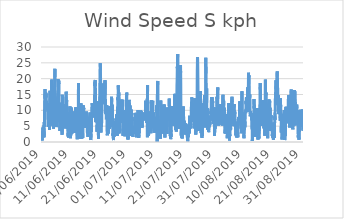
| Category | Wind Speed S |
|---|---|
| 01/06/2019 | 1.1 |
| 01/06/2019 | 1.3 |
| 01/06/2019 | 0.5 |
| 01/06/2019 | 2.7 |
| 01/06/2019 | 2.6 |
| 01/06/2019 | 2.9 |
| 01/06/2019 | 3.8 |
| 01/06/2019 | 4.6 |
| 01/06/2019 | 2.7 |
| 01/06/2019 | 2.6 |
| 01/06/2019 | 1.5 |
| 01/06/2019 | 2.6 |
| 01/06/2019 | 3.7 |
| 01/06/2019 | 4.8 |
| 01/06/2019 | 2.3 |
| 01/06/2019 | 3.3 |
| 01/06/2019 | 1.5 |
| 01/06/2019 | 4.6 |
| 01/06/2019 | 6.3 |
| 01/06/2019 | 4.8 |
| 01/06/2019 | 5.8 |
| 01/06/2019 | 10.3 |
| 01/06/2019 | 9.5 |
| 01/06/2019 | 13.1 |
| 02/06/2019 | 15.8 |
| 02/06/2019 | 16.7 |
| 02/06/2019 | 13.6 |
| 02/06/2019 | 13.5 |
| 02/06/2019 | 15 |
| 02/06/2019 | 13.7 |
| 02/06/2019 | 14.1 |
| 02/06/2019 | 15.6 |
| 02/06/2019 | 14 |
| 02/06/2019 | 15.3 |
| 02/06/2019 | 14.8 |
| 02/06/2019 | 14.3 |
| 02/06/2019 | 14.1 |
| 02/06/2019 | 12.6 |
| 02/06/2019 | 11.8 |
| 02/06/2019 | 10.7 |
| 02/06/2019 | 11.8 |
| 02/06/2019 | 11 |
| 02/06/2019 | 12.1 |
| 02/06/2019 | 10.6 |
| 02/06/2019 | 10 |
| 02/06/2019 | 11.6 |
| 02/06/2019 | 12.3 |
| 02/06/2019 | 10.1 |
| 03/06/2019 | 8.1 |
| 03/06/2019 | 8 |
| 03/06/2019 | 6.1 |
| 03/06/2019 | 4.8 |
| 03/06/2019 | 4.5 |
| 03/06/2019 | 5.1 |
| 03/06/2019 | 5.2 |
| 03/06/2019 | 4.9 |
| 03/06/2019 | 8 |
| 03/06/2019 | 11.1 |
| 03/06/2019 | 9.2 |
| 03/06/2019 | 9.6 |
| 03/06/2019 | 11 |
| 03/06/2019 | 12.2 |
| 03/06/2019 | 10.5 |
| 03/06/2019 | 3.9 |
| 03/06/2019 | 7.6 |
| 03/06/2019 | 5.5 |
| 03/06/2019 | 9 |
| 03/06/2019 | 16.2 |
| 03/06/2019 | 11.2 |
| 03/06/2019 | 9.7 |
| 03/06/2019 | 13.3 |
| 03/06/2019 | 16 |
| 04/06/2019 | 7.8 |
| 04/06/2019 | 7.8 |
| 04/06/2019 | 5.3 |
| 04/06/2019 | 8.8 |
| 04/06/2019 | 10.4 |
| 04/06/2019 | 7.4 |
| 04/06/2019 | 11.9 |
| 04/06/2019 | 14.7 |
| 04/06/2019 | 18.6 |
| 04/06/2019 | 19.7 |
| 04/06/2019 | 15.5 |
| 04/06/2019 | 16.2 |
| 04/06/2019 | 17.1 |
| 04/06/2019 | 17.3 |
| 04/06/2019 | 15.9 |
| 04/06/2019 | 12.7 |
| 04/06/2019 | 11.6 |
| 04/06/2019 | 10.7 |
| 04/06/2019 | 10.4 |
| 04/06/2019 | 8.7 |
| 04/06/2019 | 6.2 |
| 04/06/2019 | 5 |
| 04/06/2019 | 5.6 |
| 04/06/2019 | 5.1 |
| 05/06/2019 | 4.2 |
| 05/06/2019 | 5.1 |
| 05/06/2019 | 5 |
| 05/06/2019 | 6.3 |
| 05/06/2019 | 5.9 |
| 05/06/2019 | 4.8 |
| 05/06/2019 | 5.1 |
| 05/06/2019 | 6.1 |
| 05/06/2019 | 14.1 |
| 05/06/2019 | 17.4 |
| 05/06/2019 | 19.5 |
| 05/06/2019 | 21.9 |
| 05/06/2019 | 23.1 |
| 05/06/2019 | 20.5 |
| 05/06/2019 | 15.9 |
| 05/06/2019 | 13.1 |
| 05/06/2019 | 12.9 |
| 05/06/2019 | 13.1 |
| 05/06/2019 | 11.1 |
| 05/06/2019 | 9 |
| 05/06/2019 | 8.4 |
| 05/06/2019 | 6.4 |
| 05/06/2019 | 5.7 |
| 05/06/2019 | 7.4 |
| 06/06/2019 | 7.9 |
| 06/06/2019 | 5.9 |
| 06/06/2019 | 5.2 |
| 06/06/2019 | 5.4 |
| 06/06/2019 | 4.7 |
| 06/06/2019 | 6.2 |
| 06/06/2019 | 6.8 |
| 06/06/2019 | 9.4 |
| 06/06/2019 | 12.1 |
| 06/06/2019 | 13.4 |
| 06/06/2019 | 14 |
| 06/06/2019 | 12.3 |
| 06/06/2019 | 14.7 |
| 06/06/2019 | 15.3 |
| 06/06/2019 | 18.3 |
| 06/06/2019 | 19.9 |
| 06/06/2019 | 18.9 |
| 06/06/2019 | 17.7 |
| 06/06/2019 | 17.1 |
| 06/06/2019 | 16.9 |
| 06/06/2019 | 17.1 |
| 06/06/2019 | 19.4 |
| 06/06/2019 | 18.3 |
| 06/06/2019 | 13.5 |
| 07/06/2019 | 9.4 |
| 07/06/2019 | 6.3 |
| 07/06/2019 | 7.4 |
| 07/06/2019 | 7.5 |
| 07/06/2019 | 8.4 |
| 07/06/2019 | 6.5 |
| 07/06/2019 | 8.6 |
| 07/06/2019 | 3.5 |
| 07/06/2019 | 6.8 |
| 07/06/2019 | 10.2 |
| 07/06/2019 | 8.7 |
| 07/06/2019 | 12 |
| 07/06/2019 | 10.5 |
| 07/06/2019 | 12.4 |
| 07/06/2019 | 11.5 |
| 07/06/2019 | 10.3 |
| 07/06/2019 | 9.3 |
| 07/06/2019 | 9.7 |
| 07/06/2019 | 9.8 |
| 07/06/2019 | 9.7 |
| 07/06/2019 | 7.4 |
| 07/06/2019 | 6.2 |
| 07/06/2019 | 6.2 |
| 07/06/2019 | 8.1 |
| 08/06/2019 | 3.1 |
| 08/06/2019 | 2.3 |
| 08/06/2019 | 4.6 |
| 08/06/2019 | 14.9 |
| 08/06/2019 | 13 |
| 08/06/2019 | 13 |
| 08/06/2019 | 11.3 |
| 08/06/2019 | 8.5 |
| 08/06/2019 | 8.4 |
| 08/06/2019 | 8.9 |
| 08/06/2019 | 9.6 |
| 08/06/2019 | 10.6 |
| 08/06/2019 | 10.4 |
| 08/06/2019 | 11.3 |
| 08/06/2019 | 10.6 |
| 08/06/2019 | 9.5 |
| 08/06/2019 | 8.7 |
| 08/06/2019 | 9.1 |
| 08/06/2019 | 6.9 |
| 08/06/2019 | 4.9 |
| 08/06/2019 | 4.3 |
| 08/06/2019 | 6.1 |
| 08/06/2019 | 6.7 |
| 08/06/2019 | 6.8 |
| 09/06/2019 | 7.4 |
| 09/06/2019 | 6.2 |
| 09/06/2019 | 4.9 |
| 09/06/2019 | 5 |
| 09/06/2019 | 4.8 |
| 09/06/2019 | 4.6 |
| 09/06/2019 | 6.5 |
| 09/06/2019 | 5.9 |
| 09/06/2019 | 12 |
| 09/06/2019 | 8.7 |
| 09/06/2019 | 14.3 |
| 09/06/2019 | 15.9 |
| 09/06/2019 | 15.2 |
| 09/06/2019 | 11.6 |
| 09/06/2019 | 12.4 |
| 09/06/2019 | 13.3 |
| 09/06/2019 | 12.7 |
| 09/06/2019 | 11.9 |
| 09/06/2019 | 9.4 |
| 09/06/2019 | 5.6 |
| 09/06/2019 | 4.1 |
| 09/06/2019 | 5.8 |
| 09/06/2019 | 5.4 |
| 09/06/2019 | 5.4 |
| 10/06/2019 | 4.3 |
| 10/06/2019 | 4.1 |
| 10/06/2019 | 4.1 |
| 10/06/2019 | 2.4 |
| 10/06/2019 | 1.8 |
| 10/06/2019 | 2.9 |
| 10/06/2019 | 1.4 |
| 10/06/2019 | 1.9 |
| 10/06/2019 | 2.5 |
| 10/06/2019 | 3 |
| 10/06/2019 | 1.8 |
| 10/06/2019 | 5.8 |
| 10/06/2019 | 8.7 |
| 10/06/2019 | 9.5 |
| 10/06/2019 | 8.3 |
| 10/06/2019 | 8.8 |
| 10/06/2019 | 8.6 |
| 10/06/2019 | 7.9 |
| 10/06/2019 | 7.1 |
| 10/06/2019 | 11.2 |
| 10/06/2019 | 7.6 |
| 10/06/2019 | 4.4 |
| 10/06/2019 | 6.6 |
| 10/06/2019 | 3.6 |
| 11/06/2019 | 1.2 |
| 11/06/2019 | 3.8 |
| 11/06/2019 | 2.1 |
| 11/06/2019 | 2.8 |
| 11/06/2019 | 3.1 |
| 11/06/2019 | 2.8 |
| 11/06/2019 | 9.1 |
| 11/06/2019 | 10.9 |
| 11/06/2019 | 8.7 |
| 11/06/2019 | 4.9 |
| 11/06/2019 | 2.5 |
| 11/06/2019 | 5 |
| 11/06/2019 | 6.3 |
| 11/06/2019 | 6.9 |
| 11/06/2019 | 5.9 |
| 11/06/2019 | 3.8 |
| 11/06/2019 | 9.6 |
| 11/06/2019 | 8.9 |
| 11/06/2019 | 8.3 |
| 11/06/2019 | 7.5 |
| 11/06/2019 | 7.1 |
| 11/06/2019 | 6.6 |
| 11/06/2019 | 6.9 |
| 11/06/2019 | 4.9 |
| 12/06/2019 | 4.4 |
| 12/06/2019 | 4.8 |
| 12/06/2019 | 3.5 |
| 12/06/2019 | 2.9 |
| 12/06/2019 | 3.3 |
| 12/06/2019 | 3.5 |
| 12/06/2019 | 4.3 |
| 12/06/2019 | 3.5 |
| 12/06/2019 | 4.3 |
| 12/06/2019 | 4.6 |
| 12/06/2019 | 5.9 |
| 12/06/2019 | 8.1 |
| 12/06/2019 | 7.1 |
| 12/06/2019 | 6.5 |
| 12/06/2019 | 7.7 |
| 12/06/2019 | 8 |
| 12/06/2019 | 2.9 |
| 12/06/2019 | 7.6 |
| 12/06/2019 | 9.2 |
| 12/06/2019 | 11 |
| 12/06/2019 | 10 |
| 12/06/2019 | 8.6 |
| 12/06/2019 | 10.5 |
| 12/06/2019 | 9.4 |
| 13/06/2019 | 9.6 |
| 13/06/2019 | 8.2 |
| 13/06/2019 | 4.3 |
| 13/06/2019 | 4.5 |
| 13/06/2019 | 5.4 |
| 13/06/2019 | 5 |
| 13/06/2019 | 5.6 |
| 13/06/2019 | 3.4 |
| 13/06/2019 | 0.9 |
| 13/06/2019 | 3.3 |
| 13/06/2019 | 5.2 |
| 13/06/2019 | 2.7 |
| 13/06/2019 | 4.9 |
| 13/06/2019 | 5.2 |
| 13/06/2019 | 4.6 |
| 13/06/2019 | 4 |
| 13/06/2019 | 3.7 |
| 13/06/2019 | 3.9 |
| 13/06/2019 | 2.2 |
| 13/06/2019 | 18.6 |
| 13/06/2019 | 1.9 |
| 13/06/2019 | 2.4 |
| 13/06/2019 | 6.7 |
| 13/06/2019 | 4.4 |
| 14/06/2019 | 2.6 |
| 14/06/2019 | 2.7 |
| 14/06/2019 | 3.9 |
| 14/06/2019 | 1.8 |
| 14/06/2019 | 1 |
| 14/06/2019 | 1.5 |
| 14/06/2019 | 2.5 |
| 14/06/2019 | 3.8 |
| 14/06/2019 | 2.4 |
| 14/06/2019 | 1.7 |
| 14/06/2019 | 1 |
| 14/06/2019 | 3.1 |
| 14/06/2019 | 5.5 |
| 14/06/2019 | 5.9 |
| 14/06/2019 | 8.8 |
| 14/06/2019 | 10.5 |
| 14/06/2019 | 12.2 |
| 14/06/2019 | 5.6 |
| 14/06/2019 | 5.8 |
| 14/06/2019 | 5 |
| 14/06/2019 | 9.9 |
| 14/06/2019 | 9.9 |
| 14/06/2019 | 4.9 |
| 14/06/2019 | 1 |
| 15/06/2019 | 2.2 |
| 15/06/2019 | 5.1 |
| 15/06/2019 | 1.6 |
| 15/06/2019 | 3.1 |
| 15/06/2019 | 4.6 |
| 15/06/2019 | 4.7 |
| 15/06/2019 | 2.6 |
| 15/06/2019 | 1.3 |
| 15/06/2019 | 5.3 |
| 15/06/2019 | 8.3 |
| 15/06/2019 | 9.3 |
| 15/06/2019 | 10.9 |
| 15/06/2019 | 11.6 |
| 15/06/2019 | 9.5 |
| 15/06/2019 | 9.6 |
| 15/06/2019 | 10.8 |
| 15/06/2019 | 10.3 |
| 15/06/2019 | 9.1 |
| 15/06/2019 | 8.6 |
| 15/06/2019 | 7.8 |
| 15/06/2019 | 9 |
| 15/06/2019 | 8.6 |
| 15/06/2019 | 7.6 |
| 15/06/2019 | 6.8 |
| 16/06/2019 | 6.2 |
| 16/06/2019 | 6.4 |
| 16/06/2019 | 7.2 |
| 16/06/2019 | 7.3 |
| 16/06/2019 | 5.2 |
| 16/06/2019 | 4.4 |
| 16/06/2019 | 7 |
| 16/06/2019 | 9.2 |
| 16/06/2019 | 9 |
| 16/06/2019 | 9.1 |
| 16/06/2019 | 9.5 |
| 16/06/2019 | 7.2 |
| 16/06/2019 | 5.5 |
| 16/06/2019 | 7.2 |
| 16/06/2019 | 9.6 |
| 16/06/2019 | 9.3 |
| 16/06/2019 | 6.9 |
| 16/06/2019 | 8.2 |
| 16/06/2019 | 6.3 |
| 16/06/2019 | 7.8 |
| 16/06/2019 | 6.7 |
| 16/06/2019 | 3.4 |
| 16/06/2019 | 2.9 |
| 16/06/2019 | 3.7 |
| 17/06/2019 | 2.6 |
| 17/06/2019 | 2.4 |
| 17/06/2019 | 1.6 |
| 17/06/2019 | 1.4 |
| 17/06/2019 | 2.4 |
| 17/06/2019 | 2.1 |
| 17/06/2019 | 3.3 |
| 17/06/2019 | 7.4 |
| 17/06/2019 | 5.1 |
| 17/06/2019 | 3.7 |
| 17/06/2019 | 2.7 |
| 17/06/2019 | 2.6 |
| 17/06/2019 | 5.2 |
| 17/06/2019 | 1.6 |
| 17/06/2019 | 3.7 |
| 17/06/2019 | 5.1 |
| 17/06/2019 | 5.7 |
| 17/06/2019 | 6.3 |
| 17/06/2019 | 8.1 |
| 17/06/2019 | 8.7 |
| 17/06/2019 | 9.3 |
| 17/06/2019 | 4.7 |
| 17/06/2019 | 3.6 |
| 17/06/2019 | 4.6 |
| 18/06/2019 | 4 |
| 18/06/2019 | 3.5 |
| 18/06/2019 | 2.4 |
| 18/06/2019 | 0.6 |
| 18/06/2019 | 2.5 |
| 18/06/2019 | 3.1 |
| 18/06/2019 | 3.5 |
| 18/06/2019 | 4.4 |
| 18/06/2019 | 3.2 |
| 18/06/2019 | 5.4 |
| 18/06/2019 | 8.6 |
| 18/06/2019 | 10.4 |
| 18/06/2019 | 11.2 |
| 18/06/2019 | 11.8 |
| 18/06/2019 | 12.3 |
| 18/06/2019 | 12.5 |
| 18/06/2019 | 12.2 |
| 18/06/2019 | 11.6 |
| 18/06/2019 | 10.3 |
| 18/06/2019 | 9.7 |
| 18/06/2019 | 9.8 |
| 18/06/2019 | 10.1 |
| 18/06/2019 | 10.7 |
| 18/06/2019 | 9.2 |
| 19/06/2019 | 8.3 |
| 19/06/2019 | 7.7 |
| 19/06/2019 | 9.8 |
| 19/06/2019 | 10 |
| 19/06/2019 | 8.6 |
| 19/06/2019 | 10.7 |
| 19/06/2019 | 10.4 |
| 19/06/2019 | 10.3 |
| 19/06/2019 | 9.7 |
| 19/06/2019 | 11.3 |
| 19/06/2019 | 13.1 |
| 19/06/2019 | 14.9 |
| 19/06/2019 | 18.8 |
| 19/06/2019 | 17.7 |
| 19/06/2019 | 19.2 |
| 19/06/2019 | 19 |
| 19/06/2019 | 19.6 |
| 19/06/2019 | 17.6 |
| 19/06/2019 | 16.1 |
| 19/06/2019 | 14.4 |
| 19/06/2019 | 11.1 |
| 19/06/2019 | 6.3 |
| 19/06/2019 | 7.8 |
| 19/06/2019 | 7.2 |
| 20/06/2019 | 6.2 |
| 20/06/2019 | 8.4 |
| 20/06/2019 | 8 |
| 20/06/2019 | 8.3 |
| 20/06/2019 | 11.7 |
| 20/06/2019 | 12.9 |
| 20/06/2019 | 9.7 |
| 20/06/2019 | 3.2 |
| 20/06/2019 | 3.5 |
| 20/06/2019 | 5.4 |
| 20/06/2019 | 4.4 |
| 20/06/2019 | 4.9 |
| 20/06/2019 | 5.6 |
| 20/06/2019 | 5.5 |
| 20/06/2019 | 6.5 |
| 20/06/2019 | 6.1 |
| 20/06/2019 | 4 |
| 20/06/2019 | 6.2 |
| 20/06/2019 | 4 |
| 20/06/2019 | 1 |
| 20/06/2019 | 5 |
| 20/06/2019 | 5 |
| 20/06/2019 | 5.9 |
| 20/06/2019 | 7.5 |
| 21/06/2019 | 10.4 |
| 21/06/2019 | 11.7 |
| 21/06/2019 | 11 |
| 21/06/2019 | 11.3 |
| 21/06/2019 | 10.4 |
| 21/06/2019 | 10.1 |
| 21/06/2019 | 14.4 |
| 21/06/2019 | 17.3 |
| 21/06/2019 | 22.2 |
| 21/06/2019 | 21.9 |
| 21/06/2019 | 23.3 |
| 21/06/2019 | 24.9 |
| 21/06/2019 | 22.6 |
| 21/06/2019 | 19.7 |
| 21/06/2019 | 18.9 |
| 21/06/2019 | 14.9 |
| 21/06/2019 | 3 |
| 21/06/2019 | 6 |
| 21/06/2019 | 8.4 |
| 21/06/2019 | 9 |
| 21/06/2019 | 6.5 |
| 21/06/2019 | 4.8 |
| 21/06/2019 | 5.9 |
| 21/06/2019 | 7.5 |
| 22/06/2019 | 9 |
| 22/06/2019 | 10.5 |
| 22/06/2019 | 11.1 |
| 22/06/2019 | 13.4 |
| 22/06/2019 | 15.4 |
| 22/06/2019 | 16.6 |
| 22/06/2019 | 16.5 |
| 22/06/2019 | 18.5 |
| 22/06/2019 | 15.4 |
| 22/06/2019 | 13.6 |
| 22/06/2019 | 16.8 |
| 22/06/2019 | 16.6 |
| 22/06/2019 | 15.9 |
| 22/06/2019 | 17.2 |
| 22/06/2019 | 18 |
| 22/06/2019 | 15.3 |
| 22/06/2019 | 14.8 |
| 22/06/2019 | 15.9 |
| 22/06/2019 | 15.4 |
| 22/06/2019 | 15.5 |
| 22/06/2019 | 15.6 |
| 22/06/2019 | 12 |
| 22/06/2019 | 17.9 |
| 22/06/2019 | 17.6 |
| 23/06/2019 | 18.7 |
| 23/06/2019 | 14.8 |
| 23/06/2019 | 19.5 |
| 23/06/2019 | 12.9 |
| 23/06/2019 | 12.4 |
| 23/06/2019 | 12.7 |
| 23/06/2019 | 13.5 |
| 23/06/2019 | 11.9 |
| 23/06/2019 | 9.5 |
| 23/06/2019 | 10.5 |
| 23/06/2019 | 8.8 |
| 23/06/2019 | 10.1 |
| 23/06/2019 | 9.1 |
| 23/06/2019 | 8.3 |
| 23/06/2019 | 7.2 |
| 23/06/2019 | 7.5 |
| 23/06/2019 | 9.8 |
| 23/06/2019 | 11.6 |
| 23/06/2019 | 8 |
| 23/06/2019 | 7.4 |
| 23/06/2019 | 3.8 |
| 23/06/2019 | 2.5 |
| 23/06/2019 | 2.1 |
| 23/06/2019 | 2 |
| 24/06/2019 | 3.9 |
| 24/06/2019 | 5.2 |
| 24/06/2019 | 3.8 |
| 24/06/2019 | 5.1 |
| 24/06/2019 | 3.1 |
| 24/06/2019 | 4.4 |
| 24/06/2019 | 2.7 |
| 24/06/2019 | 4.3 |
| 24/06/2019 | 3.4 |
| 24/06/2019 | 7.1 |
| 24/06/2019 | 9.1 |
| 24/06/2019 | 5.8 |
| 24/06/2019 | 5.7 |
| 24/06/2019 | 7.1 |
| 24/06/2019 | 4.1 |
| 24/06/2019 | 7.7 |
| 24/06/2019 | 8.9 |
| 24/06/2019 | 6.9 |
| 24/06/2019 | 10.6 |
| 24/06/2019 | 11.4 |
| 24/06/2019 | 6.5 |
| 24/06/2019 | 5.2 |
| 24/06/2019 | 4.8 |
| 24/06/2019 | 5.5 |
| 25/06/2019 | 5.7 |
| 25/06/2019 | 4.7 |
| 25/06/2019 | 5.4 |
| 25/06/2019 | 5.7 |
| 25/06/2019 | 5.5 |
| 25/06/2019 | 6.1 |
| 25/06/2019 | 7.4 |
| 25/06/2019 | 6 |
| 25/06/2019 | 7.4 |
| 25/06/2019 | 11.6 |
| 25/06/2019 | 14.3 |
| 25/06/2019 | 12.7 |
| 25/06/2019 | 9.2 |
| 25/06/2019 | 11.8 |
| 25/06/2019 | 12 |
| 25/06/2019 | 10.7 |
| 25/06/2019 | 9.5 |
| 25/06/2019 | 11.5 |
| 25/06/2019 | 8.4 |
| 25/06/2019 | 5.3 |
| 25/06/2019 | 3.9 |
| 25/06/2019 | 1.9 |
| 25/06/2019 | 2.7 |
| 25/06/2019 | 2.4 |
| 26/06/2019 | 3 |
| 26/06/2019 | 2.8 |
| 26/06/2019 | 0.6 |
| 26/06/2019 | 2.1 |
| 26/06/2019 | 3.6 |
| 26/06/2019 | 3.1 |
| 26/06/2019 | 3.3 |
| 26/06/2019 | 2.8 |
| 26/06/2019 | 2.4 |
| 26/06/2019 | 1.7 |
| 26/06/2019 | 3.3 |
| 26/06/2019 | 3.2 |
| 26/06/2019 | 3.9 |
| 26/06/2019 | 4.4 |
| 26/06/2019 | 5.2 |
| 26/06/2019 | 5 |
| 26/06/2019 | 6.3 |
| 26/06/2019 | 5.3 |
| 26/06/2019 | 3.3 |
| 26/06/2019 | 5.1 |
| 26/06/2019 | 6.7 |
| 26/06/2019 | 5.7 |
| 26/06/2019 | 5 |
| 26/06/2019 | 5 |
| 27/06/2019 | 7.4 |
| 27/06/2019 | 7.6 |
| 27/06/2019 | 6.9 |
| 27/06/2019 | 8.7 |
| 27/06/2019 | 6 |
| 27/06/2019 | 6.6 |
| 27/06/2019 | 7.6 |
| 27/06/2019 | 8.5 |
| 27/06/2019 | 4.9 |
| 27/06/2019 | 1.9 |
| 27/06/2019 | 1.9 |
| 27/06/2019 | 5 |
| 27/06/2019 | 8.8 |
| 27/06/2019 | 11.6 |
| 27/06/2019 | 14.1 |
| 27/06/2019 | 13.2 |
| 27/06/2019 | 13.6 |
| 27/06/2019 | 14.9 |
| 27/06/2019 | 17.9 |
| 27/06/2019 | 17.3 |
| 27/06/2019 | 13.4 |
| 27/06/2019 | 13.4 |
| 27/06/2019 | 15.3 |
| 27/06/2019 | 15.7 |
| 28/06/2019 | 11.5 |
| 28/06/2019 | 2.7 |
| 28/06/2019 | 3.1 |
| 28/06/2019 | 5.8 |
| 28/06/2019 | 3.1 |
| 28/06/2019 | 12.2 |
| 28/06/2019 | 8.6 |
| 28/06/2019 | 7.1 |
| 28/06/2019 | 7.3 |
| 28/06/2019 | 6.8 |
| 28/06/2019 | 7.3 |
| 28/06/2019 | 6 |
| 28/06/2019 | 7.1 |
| 28/06/2019 | 10.5 |
| 28/06/2019 | 12.1 |
| 28/06/2019 | 11 |
| 28/06/2019 | 11.2 |
| 28/06/2019 | 12.5 |
| 28/06/2019 | 12.7 |
| 28/06/2019 | 11.6 |
| 28/06/2019 | 10.5 |
| 28/06/2019 | 11.9 |
| 28/06/2019 | 13 |
| 28/06/2019 | 13.4 |
| 29/06/2019 | 9.6 |
| 29/06/2019 | 11.5 |
| 29/06/2019 | 6.9 |
| 29/06/2019 | 9.8 |
| 29/06/2019 | 12.9 |
| 29/06/2019 | 9 |
| 29/06/2019 | 10.3 |
| 29/06/2019 | 13.3 |
| 29/06/2019 | 11.2 |
| 29/06/2019 | 3.7 |
| 29/06/2019 | 2 |
| 29/06/2019 | 4.2 |
| 29/06/2019 | 5.8 |
| 29/06/2019 | 6.7 |
| 29/06/2019 | 6.9 |
| 29/06/2019 | 7.9 |
| 29/06/2019 | 10 |
| 29/06/2019 | 7.3 |
| 29/06/2019 | 7.6 |
| 29/06/2019 | 6.8 |
| 29/06/2019 | 6.5 |
| 29/06/2019 | 4.3 |
| 29/06/2019 | 1.9 |
| 29/06/2019 | 1.8 |
| 30/06/2019 | 2.7 |
| 30/06/2019 | 3.2 |
| 30/06/2019 | 1.8 |
| 30/06/2019 | 3.1 |
| 30/06/2019 | 3 |
| 30/06/2019 | 4.7 |
| 30/06/2019 | 8.7 |
| 30/06/2019 | 8.8 |
| 30/06/2019 | 6.8 |
| 30/06/2019 | 7.3 |
| 30/06/2019 | 7.3 |
| 30/06/2019 | 8.4 |
| 30/06/2019 | 8.2 |
| 30/06/2019 | 8.6 |
| 30/06/2019 | 9.2 |
| 30/06/2019 | 8.5 |
| 30/06/2019 | 12.3 |
| 30/06/2019 | 15.6 |
| 30/06/2019 | 14.8 |
| 30/06/2019 | 12 |
| 30/06/2019 | 10.3 |
| 30/06/2019 | 6 |
| 30/06/2019 | 4.9 |
| 30/06/2019 | 4.5 |
| 01/07/2019 | 2.5 |
| 01/07/2019 | 2.7 |
| 01/07/2019 | 1.1 |
| 01/07/2019 | 1.9 |
| 01/07/2019 | 1.6 |
| 01/07/2019 | 0.8 |
| 01/07/2019 | 2.3 |
| 01/07/2019 | 3.3 |
| 01/07/2019 | 6.5 |
| 01/07/2019 | 8.2 |
| 01/07/2019 | 9 |
| 01/07/2019 | 9 |
| 01/07/2019 | 10.3 |
| 01/07/2019 | 11.8 |
| 01/07/2019 | 13.3 |
| 01/07/2019 | 12.9 |
| 01/07/2019 | 12.3 |
| 01/07/2019 | 11.7 |
| 01/07/2019 | 10.6 |
| 01/07/2019 | 9 |
| 01/07/2019 | 6.1 |
| 01/07/2019 | 11.5 |
| 01/07/2019 | 5.5 |
| 01/07/2019 | 7.6 |
| 02/07/2019 | 2 |
| 02/07/2019 | 2.9 |
| 02/07/2019 | 3.2 |
| 02/07/2019 | 3.6 |
| 02/07/2019 | 5.1 |
| 02/07/2019 | 7.4 |
| 02/07/2019 | 10.2 |
| 02/07/2019 | 10.5 |
| 02/07/2019 | 10.2 |
| 02/07/2019 | 10 |
| 02/07/2019 | 9.7 |
| 02/07/2019 | 8.7 |
| 02/07/2019 | 9.1 |
| 02/07/2019 | 6.8 |
| 02/07/2019 | 7.9 |
| 02/07/2019 | 6.7 |
| 02/07/2019 | 7.3 |
| 02/07/2019 | 5.4 |
| 02/07/2019 | 5.3 |
| 02/07/2019 | 5.3 |
| 02/07/2019 | 2.9 |
| 02/07/2019 | 2 |
| 02/07/2019 | 1.6 |
| 02/07/2019 | 2.6 |
| 03/07/2019 | 2.6 |
| 03/07/2019 | 2.6 |
| 03/07/2019 | 4.3 |
| 03/07/2019 | 4.2 |
| 03/07/2019 | 2.8 |
| 03/07/2019 | 2.7 |
| 03/07/2019 | 2.8 |
| 03/07/2019 | 3.7 |
| 03/07/2019 | 2.5 |
| 03/07/2019 | 2.8 |
| 03/07/2019 | 2.2 |
| 03/07/2019 | 3.2 |
| 03/07/2019 | 3 |
| 03/07/2019 | 4.4 |
| 03/07/2019 | 5 |
| 03/07/2019 | 5.5 |
| 03/07/2019 | 5.2 |
| 03/07/2019 | 7.5 |
| 03/07/2019 | 9.2 |
| 03/07/2019 | 8.9 |
| 03/07/2019 | 7 |
| 03/07/2019 | 6.7 |
| 03/07/2019 | 5.9 |
| 03/07/2019 | 4.4 |
| 04/07/2019 | 5.5 |
| 04/07/2019 | 3.8 |
| 04/07/2019 | 2.5 |
| 04/07/2019 | 2.9 |
| 04/07/2019 | 1.5 |
| 04/07/2019 | 2 |
| 04/07/2019 | 3.3 |
| 04/07/2019 | 6 |
| 04/07/2019 | 5.1 |
| 04/07/2019 | 4.9 |
| 04/07/2019 | 5.1 |
| 04/07/2019 | 6.2 |
| 04/07/2019 | 6.8 |
| 04/07/2019 | 4.3 |
| 04/07/2019 | 4 |
| 04/07/2019 | 7.4 |
| 04/07/2019 | 10.1 |
| 04/07/2019 | 5.7 |
| 04/07/2019 | 4.1 |
| 04/07/2019 | 4.8 |
| 04/07/2019 | 8.8 |
| 04/07/2019 | 5.1 |
| 04/07/2019 | 4.3 |
| 04/07/2019 | 1.3 |
| 05/07/2019 | 1.2 |
| 05/07/2019 | 2.3 |
| 05/07/2019 | 3.2 |
| 05/07/2019 | 2.8 |
| 05/07/2019 | 2.6 |
| 05/07/2019 | 4.9 |
| 05/07/2019 | 5.9 |
| 05/07/2019 | 8 |
| 05/07/2019 | 7.9 |
| 05/07/2019 | 7.5 |
| 05/07/2019 | 7.7 |
| 05/07/2019 | 6.2 |
| 05/07/2019 | 7.3 |
| 05/07/2019 | 9.9 |
| 05/07/2019 | 9.1 |
| 05/07/2019 | 9.9 |
| 05/07/2019 | 9.2 |
| 05/07/2019 | 9.1 |
| 05/07/2019 | 9.8 |
| 05/07/2019 | 9 |
| 05/07/2019 | 7.4 |
| 05/07/2019 | 7 |
| 05/07/2019 | 8.6 |
| 05/07/2019 | 7.8 |
| 06/07/2019 | 6 |
| 06/07/2019 | 4.4 |
| 06/07/2019 | 5.2 |
| 06/07/2019 | 5.6 |
| 06/07/2019 | 4.7 |
| 06/07/2019 | 7.5 |
| 06/07/2019 | 7.7 |
| 06/07/2019 | 8.1 |
| 06/07/2019 | 8.3 |
| 06/07/2019 | 8.5 |
| 06/07/2019 | 8.2 |
| 06/07/2019 | 8.3 |
| 06/07/2019 | 8.3 |
| 06/07/2019 | 8.5 |
| 06/07/2019 | 9.3 |
| 06/07/2019 | 9.2 |
| 06/07/2019 | 9.2 |
| 06/07/2019 | 7.1 |
| 06/07/2019 | 8.8 |
| 06/07/2019 | 7.5 |
| 06/07/2019 | 6.8 |
| 06/07/2019 | 8.1 |
| 06/07/2019 | 7.8 |
| 06/07/2019 | 7.3 |
| 07/07/2019 | 7.3 |
| 07/07/2019 | 7.8 |
| 07/07/2019 | 7.9 |
| 07/07/2019 | 7.8 |
| 07/07/2019 | 7.1 |
| 07/07/2019 | 7.8 |
| 07/07/2019 | 7.8 |
| 07/07/2019 | 9.7 |
| 07/07/2019 | 11.6 |
| 07/07/2019 | 10.8 |
| 07/07/2019 | 13 |
| 07/07/2019 | 11.7 |
| 07/07/2019 | 11.6 |
| 07/07/2019 | 12.7 |
| 07/07/2019 | 11.3 |
| 07/07/2019 | 10.5 |
| 07/07/2019 | 10.3 |
| 07/07/2019 | 9.6 |
| 07/07/2019 | 7.5 |
| 07/07/2019 | 6 |
| 07/07/2019 | 9.2 |
| 07/07/2019 | 10.5 |
| 07/07/2019 | 13.7 |
| 07/07/2019 | 10 |
| 08/07/2019 | 1.5 |
| 08/07/2019 | 18 |
| 08/07/2019 | 10.2 |
| 08/07/2019 | 7.5 |
| 08/07/2019 | 5.6 |
| 08/07/2019 | 4.9 |
| 08/07/2019 | 6.1 |
| 08/07/2019 | 2.7 |
| 08/07/2019 | 6.8 |
| 08/07/2019 | 5.1 |
| 08/07/2019 | 2 |
| 08/07/2019 | 4.9 |
| 08/07/2019 | 5.4 |
| 08/07/2019 | 5.2 |
| 08/07/2019 | 6.7 |
| 08/07/2019 | 6.4 |
| 08/07/2019 | 9.4 |
| 08/07/2019 | 8.5 |
| 08/07/2019 | 5.9 |
| 08/07/2019 | 6.5 |
| 08/07/2019 | 5.8 |
| 08/07/2019 | 9.6 |
| 08/07/2019 | 7.5 |
| 08/07/2019 | 5.3 |
| 09/07/2019 | 6.5 |
| 09/07/2019 | 6.1 |
| 09/07/2019 | 6.5 |
| 09/07/2019 | 8.4 |
| 09/07/2019 | 7.5 |
| 09/07/2019 | 9 |
| 09/07/2019 | 8.5 |
| 09/07/2019 | 2.8 |
| 09/07/2019 | 6.6 |
| 09/07/2019 | 13.2 |
| 09/07/2019 | 9.6 |
| 09/07/2019 | 9.5 |
| 09/07/2019 | 8.9 |
| 09/07/2019 | 10.5 |
| 09/07/2019 | 6.7 |
| 09/07/2019 | 8.8 |
| 09/07/2019 | 9.2 |
| 09/07/2019 | 9.5 |
| 09/07/2019 | 6.4 |
| 09/07/2019 | 9.7 |
| 09/07/2019 | 13 |
| 09/07/2019 | 9.6 |
| 09/07/2019 | 9 |
| 09/07/2019 | 4.3 |
| 10/07/2019 | 6 |
| 10/07/2019 | 7 |
| 10/07/2019 | 9.4 |
| 10/07/2019 | 7.6 |
| 10/07/2019 | 7.7 |
| 10/07/2019 | 5.5 |
| 10/07/2019 | 5.8 |
| 10/07/2019 | 6.1 |
| 10/07/2019 | 6.2 |
| 10/07/2019 | 6 |
| 10/07/2019 | 5.7 |
| 10/07/2019 | 4.9 |
| 10/07/2019 | 2.9 |
| 10/07/2019 | 4.2 |
| 10/07/2019 | 4.8 |
| 10/07/2019 | 7.5 |
| 10/07/2019 | 6.5 |
| 10/07/2019 | 3.7 |
| 10/07/2019 | 5.9 |
| 10/07/2019 | 4.6 |
| 10/07/2019 | 3.2 |
| 10/07/2019 | 4.2 |
| 10/07/2019 | 6.2 |
| 10/07/2019 | 7.8 |
| 11/07/2019 | 7.3 |
| 11/07/2019 | 7.9 |
| 11/07/2019 | 5.9 |
| 11/07/2019 | 5.4 |
| 11/07/2019 | 6.5 |
| 11/07/2019 | 7.2 |
| 11/07/2019 | 8.8 |
| 11/07/2019 | 11.6 |
| 11/07/2019 | 9.3 |
| 11/07/2019 | 9.5 |
| 11/07/2019 | 11.3 |
| 11/07/2019 | 0 |
| 11/07/2019 | 15 |
| 11/07/2019 | 12.2 |
| 11/07/2019 | 18.4 |
| 11/07/2019 | 19.3 |
| 11/07/2019 | 12.2 |
| 11/07/2019 | 10.5 |
| 11/07/2019 | 8.5 |
| 11/07/2019 | 7.1 |
| 11/07/2019 | 6.7 |
| 11/07/2019 | 4.9 |
| 11/07/2019 | 4 |
| 11/07/2019 | 4 |
| 12/07/2019 | 3.9 |
| 12/07/2019 | 3.5 |
| 12/07/2019 | 3.7 |
| 12/07/2019 | 4.9 |
| 12/07/2019 | 7.1 |
| 12/07/2019 | 1.4 |
| 12/07/2019 | 2.5 |
| 12/07/2019 | 3 |
| 12/07/2019 | 2.5 |
| 12/07/2019 | 1.3 |
| 12/07/2019 | 2.7 |
| 12/07/2019 | 3.9 |
| 12/07/2019 | 1.2 |
| 12/07/2019 | 3.6 |
| 12/07/2019 | 1.1 |
| 12/07/2019 | 4.2 |
| 12/07/2019 | 3.9 |
| 12/07/2019 | 13.1 |
| 12/07/2019 | 7 |
| 12/07/2019 | 6.3 |
| 12/07/2019 | 5.6 |
| 12/07/2019 | 5.1 |
| 12/07/2019 | 3.4 |
| 12/07/2019 | 4.1 |
| 13/07/2019 | 3.4 |
| 13/07/2019 | 2.8 |
| 13/07/2019 | 3 |
| 13/07/2019 | 3 |
| 13/07/2019 | 3.6 |
| 13/07/2019 | 2.7 |
| 13/07/2019 | 2.6 |
| 13/07/2019 | 5.1 |
| 13/07/2019 | 6.1 |
| 13/07/2019 | 6.6 |
| 13/07/2019 | 6.8 |
| 13/07/2019 | 7.8 |
| 13/07/2019 | 7.3 |
| 13/07/2019 | 8 |
| 13/07/2019 | 7.2 |
| 13/07/2019 | 11.8 |
| 13/07/2019 | 11.4 |
| 13/07/2019 | 9.9 |
| 13/07/2019 | 8.7 |
| 13/07/2019 | 5 |
| 13/07/2019 | 5.1 |
| 13/07/2019 | 3.2 |
| 13/07/2019 | 6.5 |
| 13/07/2019 | 7.8 |
| 14/07/2019 | 11.8 |
| 14/07/2019 | 7.5 |
| 14/07/2019 | 4.2 |
| 14/07/2019 | 1.4 |
| 14/07/2019 | 3.1 |
| 14/07/2019 | 2.5 |
| 14/07/2019 | 5.2 |
| 14/07/2019 | 4.8 |
| 14/07/2019 | 9.2 |
| 14/07/2019 | 7.9 |
| 14/07/2019 | 8.3 |
| 14/07/2019 | 5.4 |
| 14/07/2019 | 6.8 |
| 14/07/2019 | 9.4 |
| 14/07/2019 | 9.3 |
| 14/07/2019 | 10.9 |
| 14/07/2019 | 10.9 |
| 14/07/2019 | 10.1 |
| 14/07/2019 | 8.1 |
| 14/07/2019 | 5 |
| 14/07/2019 | 2.6 |
| 14/07/2019 | 2.8 |
| 14/07/2019 | 2.6 |
| 14/07/2019 | 3 |
| 15/07/2019 | 6.7 |
| 15/07/2019 | 10.6 |
| 15/07/2019 | 9.5 |
| 15/07/2019 | 7.4 |
| 15/07/2019 | 7.9 |
| 15/07/2019 | 8.7 |
| 15/07/2019 | 8.1 |
| 15/07/2019 | 6.8 |
| 15/07/2019 | 7.7 |
| 15/07/2019 | 10.5 |
| 15/07/2019 | 10.1 |
| 15/07/2019 | 10.3 |
| 15/07/2019 | 10.8 |
| 15/07/2019 | 10.9 |
| 15/07/2019 | 9.5 |
| 15/07/2019 | 10.8 |
| 15/07/2019 | 13.7 |
| 15/07/2019 | 11.4 |
| 15/07/2019 | 8.5 |
| 15/07/2019 | 9 |
| 15/07/2019 | 4.8 |
| 15/07/2019 | 3 |
| 15/07/2019 | 2.9 |
| 15/07/2019 | 2.7 |
| 16/07/2019 | 2.7 |
| 16/07/2019 | 1.9 |
| 16/07/2019 | 2.7 |
| 16/07/2019 | 1.7 |
| 16/07/2019 | 0.9 |
| 16/07/2019 | 1.3 |
| 16/07/2019 | 2.6 |
| 16/07/2019 | 1.6 |
| 16/07/2019 | 3.8 |
| 16/07/2019 | 5.4 |
| 16/07/2019 | 5.3 |
| 16/07/2019 | 6 |
| 16/07/2019 | 6.3 |
| 16/07/2019 | 7.6 |
| 16/07/2019 | 10.4 |
| 16/07/2019 | 11.4 |
| 16/07/2019 | 7.6 |
| 16/07/2019 | 6.3 |
| 16/07/2019 | 6 |
| 16/07/2019 | 5.4 |
| 16/07/2019 | 6 |
| 16/07/2019 | 8.8 |
| 16/07/2019 | 9.6 |
| 16/07/2019 | 9 |
| 17/07/2019 | 7.2 |
| 17/07/2019 | 9.2 |
| 17/07/2019 | 5.3 |
| 17/07/2019 | 6.3 |
| 17/07/2019 | 5.9 |
| 17/07/2019 | 5.2 |
| 17/07/2019 | 5.2 |
| 17/07/2019 | 10.4 |
| 17/07/2019 | 10.2 |
| 17/07/2019 | 9 |
| 17/07/2019 | 7.7 |
| 17/07/2019 | 10.6 |
| 17/07/2019 | 8.6 |
| 17/07/2019 | 13 |
| 17/07/2019 | 15.2 |
| 17/07/2019 | 12.7 |
| 17/07/2019 | 9.7 |
| 17/07/2019 | 7.8 |
| 17/07/2019 | 5 |
| 17/07/2019 | 7.1 |
| 17/07/2019 | 5.5 |
| 17/07/2019 | 3.8 |
| 17/07/2019 | 5.1 |
| 17/07/2019 | 5.2 |
| 18/07/2019 | 5.5 |
| 18/07/2019 | 4.5 |
| 18/07/2019 | 3.8 |
| 18/07/2019 | 4.2 |
| 18/07/2019 | 3.3 |
| 18/07/2019 | 7.6 |
| 18/07/2019 | 10 |
| 18/07/2019 | 11.5 |
| 18/07/2019 | 14.6 |
| 18/07/2019 | 18 |
| 18/07/2019 | 19 |
| 18/07/2019 | 21 |
| 18/07/2019 | 23.8 |
| 18/07/2019 | 22.6 |
| 18/07/2019 | 25.7 |
| 18/07/2019 | 27.8 |
| 18/07/2019 | 19.7 |
| 18/07/2019 | 16.2 |
| 18/07/2019 | 11.8 |
| 18/07/2019 | 13.2 |
| 18/07/2019 | 4.1 |
| 18/07/2019 | 5.4 |
| 18/07/2019 | 6.6 |
| 18/07/2019 | 5.1 |
| 19/07/2019 | 5.6 |
| 19/07/2019 | 6.2 |
| 19/07/2019 | 5.5 |
| 19/07/2019 | 5.4 |
| 19/07/2019 | 5.5 |
| 19/07/2019 | 5.8 |
| 19/07/2019 | 7 |
| 19/07/2019 | 9.4 |
| 19/07/2019 | 12.2 |
| 19/07/2019 | 16.3 |
| 19/07/2019 | 20.8 |
| 19/07/2019 | 18.8 |
| 19/07/2019 | 20.5 |
| 19/07/2019 | 21.7 |
| 19/07/2019 | 19.1 |
| 19/07/2019 | 24.3 |
| 19/07/2019 | 21.9 |
| 19/07/2019 | 18.4 |
| 19/07/2019 | 8.8 |
| 19/07/2019 | 5.8 |
| 19/07/2019 | 4 |
| 19/07/2019 | 2 |
| 19/07/2019 | 3.1 |
| 19/07/2019 | 6.7 |
| 20/07/2019 | 4.9 |
| 20/07/2019 | 1.3 |
| 20/07/2019 | 2.8 |
| 20/07/2019 | 4.1 |
| 20/07/2019 | 2.3 |
| 20/07/2019 | 1.1 |
| 20/07/2019 | 3.3 |
| 20/07/2019 | 6.1 |
| 20/07/2019 | 5.2 |
| 20/07/2019 | 6.9 |
| 20/07/2019 | 7 |
| 20/07/2019 | 8.7 |
| 20/07/2019 | 9.9 |
| 20/07/2019 | 9.1 |
| 20/07/2019 | 11.2 |
| 20/07/2019 | 8.1 |
| 20/07/2019 | 11 |
| 20/07/2019 | 8.2 |
| 20/07/2019 | 6.7 |
| 20/07/2019 | 4.3 |
| 20/07/2019 | 4.6 |
| 20/07/2019 | 2.9 |
| 20/07/2019 | 3.5 |
| 20/07/2019 | 6 |
| 21/07/2019 | 6.7 |
| 21/07/2019 | 5.3 |
| 21/07/2019 | 6 |
| 21/07/2019 | 3.3 |
| 21/07/2019 | 5.1 |
| 21/07/2019 | 5 |
| 21/07/2019 | 2.4 |
| 21/07/2019 | 2.2 |
| 21/07/2019 | 2.1 |
| 21/07/2019 | 4.5 |
| 21/07/2019 | 5.8 |
| 21/07/2019 | 5.7 |
| 21/07/2019 | 5 |
| 21/07/2019 | 3.3 |
| 21/07/2019 | 3.3 |
| 21/07/2019 | 3.1 |
| 21/07/2019 | 3.2 |
| 21/07/2019 | 4 |
| 21/07/2019 | 5.5 |
| 21/07/2019 | 4.9 |
| 21/07/2019 | 3.5 |
| 21/07/2019 | 3.7 |
| 21/07/2019 | 2.5 |
| 21/07/2019 | 3.9 |
| 22/07/2019 | 1.8 |
| 22/07/2019 | 1.1 |
| 22/07/2019 | 1.1 |
| 22/07/2019 | 1.2 |
| 22/07/2019 | 0.2 |
| 22/07/2019 | 0.7 |
| 22/07/2019 | 1.1 |
| 22/07/2019 | 2.1 |
| 22/07/2019 | 2.1 |
| 22/07/2019 | 1.5 |
| 22/07/2019 | 3.4 |
| 22/07/2019 | 3.6 |
| 22/07/2019 | 3.6 |
| 22/07/2019 | 4.4 |
| 22/07/2019 | 3.4 |
| 22/07/2019 | 2.6 |
| 22/07/2019 | 3.5 |
| 22/07/2019 | 2.9 |
| 22/07/2019 | 4.5 |
| 22/07/2019 | 8.3 |
| 22/07/2019 | 7.4 |
| 22/07/2019 | 5.5 |
| 22/07/2019 | 5.8 |
| 22/07/2019 | 7 |
| 23/07/2019 | 5.3 |
| 23/07/2019 | 4.8 |
| 23/07/2019 | 6 |
| 23/07/2019 | 6.3 |
| 23/07/2019 | 6.2 |
| 23/07/2019 | 6.1 |
| 23/07/2019 | 4.3 |
| 23/07/2019 | 4.4 |
| 23/07/2019 | 4.4 |
| 23/07/2019 | 5.8 |
| 23/07/2019 | 10.7 |
| 23/07/2019 | 11.8 |
| 23/07/2019 | 12.2 |
| 23/07/2019 | 13.3 |
| 23/07/2019 | 14.1 |
| 23/07/2019 | 13.6 |
| 23/07/2019 | 13.1 |
| 23/07/2019 | 11.6 |
| 23/07/2019 | 12.2 |
| 23/07/2019 | 10.1 |
| 23/07/2019 | 8.8 |
| 23/07/2019 | 10 |
| 23/07/2019 | 10.5 |
| 23/07/2019 | 9.8 |
| 24/07/2019 | 9.4 |
| 24/07/2019 | 9.3 |
| 24/07/2019 | 8.4 |
| 24/07/2019 | 7.4 |
| 24/07/2019 | 7.3 |
| 24/07/2019 | 6.4 |
| 24/07/2019 | 7.1 |
| 24/07/2019 | 8.1 |
| 24/07/2019 | 8.6 |
| 24/07/2019 | 8.9 |
| 24/07/2019 | 10.2 |
| 24/07/2019 | 8.9 |
| 24/07/2019 | 8.7 |
| 24/07/2019 | 4.3 |
| 24/07/2019 | 10.8 |
| 24/07/2019 | 13.8 |
| 24/07/2019 | 10.7 |
| 24/07/2019 | 9 |
| 24/07/2019 | 8.5 |
| 24/07/2019 | 9.1 |
| 24/07/2019 | 9.1 |
| 24/07/2019 | 8.1 |
| 24/07/2019 | 7.3 |
| 24/07/2019 | 10.5 |
| 25/07/2019 | 2.4 |
| 25/07/2019 | 4.9 |
| 25/07/2019 | 5 |
| 25/07/2019 | 7.8 |
| 25/07/2019 | 7.3 |
| 25/07/2019 | 5.5 |
| 25/07/2019 | 6 |
| 25/07/2019 | 5.9 |
| 25/07/2019 | 6.2 |
| 25/07/2019 | 5.2 |
| 25/07/2019 | 8.3 |
| 25/07/2019 | 15 |
| 25/07/2019 | 22.4 |
| 25/07/2019 | 24.3 |
| 25/07/2019 | 26.8 |
| 25/07/2019 | 26.3 |
| 25/07/2019 | 24.5 |
| 25/07/2019 | 24.3 |
| 25/07/2019 | 17.9 |
| 25/07/2019 | 13 |
| 25/07/2019 | 8.2 |
| 25/07/2019 | 9.4 |
| 25/07/2019 | 3.5 |
| 25/07/2019 | 7 |
| 26/07/2019 | 8.8 |
| 26/07/2019 | 10 |
| 26/07/2019 | 7.6 |
| 26/07/2019 | 8 |
| 26/07/2019 | 9.2 |
| 26/07/2019 | 7.5 |
| 26/07/2019 | 6.9 |
| 26/07/2019 | 8.5 |
| 26/07/2019 | 11.5 |
| 26/07/2019 | 11 |
| 26/07/2019 | 9.7 |
| 26/07/2019 | 14.5 |
| 26/07/2019 | 11.9 |
| 26/07/2019 | 13.5 |
| 26/07/2019 | 16.1 |
| 26/07/2019 | 15.1 |
| 26/07/2019 | 15.3 |
| 26/07/2019 | 13 |
| 26/07/2019 | 10.3 |
| 26/07/2019 | 6.5 |
| 26/07/2019 | 2.8 |
| 26/07/2019 | 2.5 |
| 26/07/2019 | 3.4 |
| 26/07/2019 | 3.2 |
| 27/07/2019 | 3.5 |
| 27/07/2019 | 3.3 |
| 27/07/2019 | 2.9 |
| 27/07/2019 | 1.3 |
| 27/07/2019 | 2.7 |
| 27/07/2019 | 2.5 |
| 27/07/2019 | 3.3 |
| 27/07/2019 | 1.9 |
| 27/07/2019 | 2.9 |
| 27/07/2019 | 7.5 |
| 27/07/2019 | 8.3 |
| 27/07/2019 | 8.5 |
| 27/07/2019 | 9.9 |
| 27/07/2019 | 10.1 |
| 27/07/2019 | 10.6 |
| 27/07/2019 | 10.5 |
| 27/07/2019 | 12.3 |
| 27/07/2019 | 11.5 |
| 27/07/2019 | 10.5 |
| 27/07/2019 | 11 |
| 27/07/2019 | 10.4 |
| 27/07/2019 | 7.8 |
| 27/07/2019 | 8 |
| 27/07/2019 | 10.5 |
| 28/07/2019 | 13.2 |
| 28/07/2019 | 14.8 |
| 28/07/2019 | 6.9 |
| 28/07/2019 | 4.6 |
| 28/07/2019 | 6.8 |
| 28/07/2019 | 5.6 |
| 28/07/2019 | 6.5 |
| 28/07/2019 | 6.6 |
| 28/07/2019 | 8 |
| 28/07/2019 | 10.2 |
| 28/07/2019 | 11.5 |
| 28/07/2019 | 21.3 |
| 28/07/2019 | 26.6 |
| 28/07/2019 | 21.6 |
| 28/07/2019 | 18.8 |
| 28/07/2019 | 18.7 |
| 28/07/2019 | 18.3 |
| 28/07/2019 | 15.4 |
| 28/07/2019 | 16.4 |
| 28/07/2019 | 16.9 |
| 28/07/2019 | 12.4 |
| 28/07/2019 | 10.6 |
| 28/07/2019 | 7.9 |
| 28/07/2019 | 9.5 |
| 29/07/2019 | 10.7 |
| 29/07/2019 | 10.8 |
| 29/07/2019 | 7 |
| 29/07/2019 | 3.9 |
| 29/07/2019 | 3.7 |
| 29/07/2019 | 5.4 |
| 29/07/2019 | 7.6 |
| 29/07/2019 | 6.6 |
| 29/07/2019 | 6.6 |
| 29/07/2019 | 6.1 |
| 29/07/2019 | 4.3 |
| 29/07/2019 | 3.5 |
| 29/07/2019 | 3.1 |
| 29/07/2019 | 3.5 |
| 29/07/2019 | 3.6 |
| 29/07/2019 | 4 |
| 29/07/2019 | 4.4 |
| 29/07/2019 | 4.3 |
| 29/07/2019 | 6.1 |
| 29/07/2019 | 5.4 |
| 29/07/2019 | 4.9 |
| 29/07/2019 | 6.5 |
| 29/07/2019 | 5.5 |
| 29/07/2019 | 6.4 |
| 30/07/2019 | 6.6 |
| 30/07/2019 | 7.4 |
| 30/07/2019 | 6.7 |
| 30/07/2019 | 7.6 |
| 30/07/2019 | 8.1 |
| 30/07/2019 | 8.7 |
| 30/07/2019 | 9.7 |
| 30/07/2019 | 9.5 |
| 30/07/2019 | 8.9 |
| 30/07/2019 | 10.9 |
| 30/07/2019 | 12.2 |
| 30/07/2019 | 12.5 |
| 30/07/2019 | 14.2 |
| 30/07/2019 | 13 |
| 30/07/2019 | 13.1 |
| 30/07/2019 | 12.4 |
| 30/07/2019 | 10.4 |
| 30/07/2019 | 13.7 |
| 30/07/2019 | 14.1 |
| 30/07/2019 | 12 |
| 30/07/2019 | 13.3 |
| 30/07/2019 | 12.2 |
| 30/07/2019 | 12.8 |
| 30/07/2019 | 12.3 |
| 31/07/2019 | 9.7 |
| 31/07/2019 | 9.5 |
| 31/07/2019 | 8.6 |
| 31/07/2019 | 7.9 |
| 31/07/2019 | 7.6 |
| 31/07/2019 | 6.3 |
| 31/07/2019 | 7.3 |
| 31/07/2019 | 5.7 |
| 31/07/2019 | 6.8 |
| 31/07/2019 | 9.1 |
| 31/07/2019 | 10.9 |
| 31/07/2019 | 7.2 |
| 31/07/2019 | 5.3 |
| 31/07/2019 | 4.7 |
| 31/07/2019 | 1.9 |
| 31/07/2019 | 5.3 |
| 31/07/2019 | 6.1 |
| 31/07/2019 | 7 |
| 31/07/2019 | 6.3 |
| 31/07/2019 | 4.2 |
| 31/07/2019 | 6.6 |
| 31/07/2019 | 7.1 |
| 31/07/2019 | 9.3 |
| 31/07/2019 | 10.9 |
| 01/08/2019 | 7 |
| 01/08/2019 | 5.8 |
| 01/08/2019 | 8.7 |
| 01/08/2019 | 6.5 |
| 01/08/2019 | 8.6 |
| 01/08/2019 | 8.1 |
| 01/08/2019 | 9.1 |
| 01/08/2019 | 10 |
| 01/08/2019 | 9.2 |
| 01/08/2019 | 9.3 |
| 01/08/2019 | 11.6 |
| 01/08/2019 | 14.3 |
| 01/08/2019 | 12.6 |
| 01/08/2019 | 11.5 |
| 01/08/2019 | 16.9 |
| 01/08/2019 | 14.9 |
| 01/08/2019 | 17.2 |
| 01/08/2019 | 13.6 |
| 01/08/2019 | 10.7 |
| 01/08/2019 | 7.9 |
| 01/08/2019 | 6.6 |
| 01/08/2019 | 7.1 |
| 01/08/2019 | 5.2 |
| 01/08/2019 | 5.8 |
| 02/08/2019 | 6.4 |
| 02/08/2019 | 8.2 |
| 02/08/2019 | 9.9 |
| 02/08/2019 | 10.5 |
| 02/08/2019 | 9 |
| 02/08/2019 | 9.1 |
| 02/08/2019 | 8.9 |
| 02/08/2019 | 9 |
| 02/08/2019 | 8.9 |
| 02/08/2019 | 9.7 |
| 02/08/2019 | 9.8 |
| 02/08/2019 | 9.7 |
| 02/08/2019 | 11.4 |
| 02/08/2019 | 12 |
| 02/08/2019 | 11.7 |
| 02/08/2019 | 12 |
| 02/08/2019 | 10.8 |
| 02/08/2019 | 8.5 |
| 02/08/2019 | 8.5 |
| 02/08/2019 | 9.4 |
| 02/08/2019 | 9 |
| 02/08/2019 | 7.7 |
| 02/08/2019 | 8.8 |
| 02/08/2019 | 7.8 |
| 03/08/2019 | 6.4 |
| 03/08/2019 | 6.6 |
| 03/08/2019 | 7.3 |
| 03/08/2019 | 7.1 |
| 03/08/2019 | 5.4 |
| 03/08/2019 | 7 |
| 03/08/2019 | 5.2 |
| 03/08/2019 | 7.1 |
| 03/08/2019 | 8.2 |
| 03/08/2019 | 9.2 |
| 03/08/2019 | 11 |
| 03/08/2019 | 12.3 |
| 03/08/2019 | 14.9 |
| 03/08/2019 | 9.4 |
| 03/08/2019 | 6.9 |
| 03/08/2019 | 8.7 |
| 03/08/2019 | 8.8 |
| 03/08/2019 | 6.4 |
| 03/08/2019 | 13.3 |
| 03/08/2019 | 11.5 |
| 03/08/2019 | 7.9 |
| 03/08/2019 | 6 |
| 03/08/2019 | 7.4 |
| 03/08/2019 | 6.1 |
| 04/08/2019 | 10.8 |
| 04/08/2019 | 9.5 |
| 04/08/2019 | 7.6 |
| 04/08/2019 | 8 |
| 04/08/2019 | 6 |
| 04/08/2019 | 3.5 |
| 04/08/2019 | 2.7 |
| 04/08/2019 | 2.6 |
| 04/08/2019 | 4 |
| 04/08/2019 | 2.8 |
| 04/08/2019 | 8.8 |
| 04/08/2019 | 9 |
| 04/08/2019 | 8.1 |
| 04/08/2019 | 4.7 |
| 04/08/2019 | 4 |
| 04/08/2019 | 2.8 |
| 04/08/2019 | 5.5 |
| 04/08/2019 | 5.6 |
| 04/08/2019 | 6.5 |
| 04/08/2019 | 4.1 |
| 04/08/2019 | 3.8 |
| 04/08/2019 | 4.6 |
| 04/08/2019 | 4.6 |
| 04/08/2019 | 3.5 |
| 05/08/2019 | 3.6 |
| 05/08/2019 | 1.2 |
| 05/08/2019 | 2.4 |
| 05/08/2019 | 4.2 |
| 05/08/2019 | 3.2 |
| 05/08/2019 | 2.2 |
| 05/08/2019 | 4.5 |
| 05/08/2019 | 4.4 |
| 05/08/2019 | 5.7 |
| 05/08/2019 | 6.9 |
| 05/08/2019 | 9.2 |
| 05/08/2019 | 10 |
| 05/08/2019 | 11.4 |
| 05/08/2019 | 12.3 |
| 05/08/2019 | 9.8 |
| 05/08/2019 | 10.7 |
| 05/08/2019 | 8.1 |
| 05/08/2019 | 8.2 |
| 05/08/2019 | 6.4 |
| 05/08/2019 | 3.4 |
| 05/08/2019 | 0.5 |
| 05/08/2019 | 2.3 |
| 05/08/2019 | 1.9 |
| 05/08/2019 | 2.4 |
| 06/08/2019 | 2.6 |
| 06/08/2019 | 3.6 |
| 06/08/2019 | 4.5 |
| 06/08/2019 | 5.1 |
| 06/08/2019 | 6.6 |
| 06/08/2019 | 3.9 |
| 06/08/2019 | 4.4 |
| 06/08/2019 | 4.2 |
| 06/08/2019 | 9.3 |
| 06/08/2019 | 8.5 |
| 06/08/2019 | 7.7 |
| 06/08/2019 | 8.9 |
| 06/08/2019 | 10.5 |
| 06/08/2019 | 11.7 |
| 06/08/2019 | 12.1 |
| 06/08/2019 | 11.2 |
| 06/08/2019 | 13.7 |
| 06/08/2019 | 14.3 |
| 06/08/2019 | 12.6 |
| 06/08/2019 | 9 |
| 06/08/2019 | 9.6 |
| 06/08/2019 | 8.4 |
| 06/08/2019 | 9.1 |
| 06/08/2019 | 8.4 |
| 07/08/2019 | 8.4 |
| 07/08/2019 | 6.9 |
| 07/08/2019 | 7 |
| 07/08/2019 | 9.2 |
| 07/08/2019 | 9.1 |
| 07/08/2019 | 9 |
| 07/08/2019 | 6.2 |
| 07/08/2019 | 5 |
| 07/08/2019 | 5.5 |
| 07/08/2019 | 7.9 |
| 07/08/2019 | 10 |
| 07/08/2019 | 12 |
| 07/08/2019 | 10.9 |
| 07/08/2019 | 9.6 |
| 07/08/2019 | 10 |
| 07/08/2019 | 8.9 |
| 07/08/2019 | 9.6 |
| 07/08/2019 | 8.8 |
| 07/08/2019 | 8.6 |
| 07/08/2019 | 7.3 |
| 07/08/2019 | 7.1 |
| 07/08/2019 | 7.2 |
| 07/08/2019 | 6.3 |
| 07/08/2019 | 4.3 |
| 08/08/2019 | 3.3 |
| 08/08/2019 | 2.1 |
| 08/08/2019 | 3.6 |
| 08/08/2019 | 4.5 |
| 08/08/2019 | 3 |
| 08/08/2019 | 2.3 |
| 08/08/2019 | 1.5 |
| 08/08/2019 | 1.9 |
| 08/08/2019 | 3.1 |
| 08/08/2019 | 1.5 |
| 08/08/2019 | 1.6 |
| 08/08/2019 | 1.5 |
| 08/08/2019 | 1.6 |
| 08/08/2019 | 4.2 |
| 08/08/2019 | 3.4 |
| 08/08/2019 | 2.1 |
| 08/08/2019 | 3.4 |
| 08/08/2019 | 1.5 |
| 08/08/2019 | 2.2 |
| 08/08/2019 | 3.3 |
| 08/08/2019 | 3.7 |
| 08/08/2019 | 4.6 |
| 08/08/2019 | 5.3 |
| 08/08/2019 | 6.5 |
| 09/08/2019 | 7.5 |
| 09/08/2019 | 7.2 |
| 09/08/2019 | 7.9 |
| 09/08/2019 | 7.8 |
| 09/08/2019 | 7.6 |
| 09/08/2019 | 5.9 |
| 09/08/2019 | 7.3 |
| 09/08/2019 | 7.1 |
| 09/08/2019 | 7.8 |
| 09/08/2019 | 10 |
| 09/08/2019 | 12.9 |
| 09/08/2019 | 10.5 |
| 09/08/2019 | 9.8 |
| 09/08/2019 | 10.8 |
| 09/08/2019 | 10.7 |
| 09/08/2019 | 12.3 |
| 09/08/2019 | 9.6 |
| 09/08/2019 | 9.9 |
| 09/08/2019 | 8.8 |
| 09/08/2019 | 5.8 |
| 09/08/2019 | 5.2 |
| 09/08/2019 | 5.6 |
| 09/08/2019 | 5.7 |
| 09/08/2019 | 4.3 |
| 10/08/2019 | 5.2 |
| 10/08/2019 | 6.4 |
| 10/08/2019 | 2.8 |
| 10/08/2019 | 9.9 |
| 10/08/2019 | 16 |
| 10/08/2019 | 8.5 |
| 10/08/2019 | 9.4 |
| 10/08/2019 | 7.6 |
| 10/08/2019 | 5.2 |
| 10/08/2019 | 6.1 |
| 10/08/2019 | 8.2 |
| 10/08/2019 | 7.4 |
| 10/08/2019 | 9 |
| 10/08/2019 | 8.9 |
| 10/08/2019 | 8.9 |
| 10/08/2019 | 8.6 |
| 10/08/2019 | 7.1 |
| 10/08/2019 | 6.8 |
| 10/08/2019 | 5.3 |
| 10/08/2019 | 3.8 |
| 10/08/2019 | 2.5 |
| 10/08/2019 | 1.2 |
| 10/08/2019 | 2.2 |
| 10/08/2019 | 2 |
| 11/08/2019 | 3.2 |
| 11/08/2019 | 3.6 |
| 11/08/2019 | 5.4 |
| 11/08/2019 | 6.7 |
| 11/08/2019 | 5.9 |
| 11/08/2019 | 4.6 |
| 11/08/2019 | 4.8 |
| 11/08/2019 | 6.3 |
| 11/08/2019 | 8.7 |
| 11/08/2019 | 9.9 |
| 11/08/2019 | 9.8 |
| 11/08/2019 | 10 |
| 11/08/2019 | 9.1 |
| 11/08/2019 | 9.3 |
| 11/08/2019 | 10.5 |
| 11/08/2019 | 13 |
| 11/08/2019 | 11.9 |
| 11/08/2019 | 12.7 |
| 11/08/2019 | 14.2 |
| 11/08/2019 | 13.5 |
| 11/08/2019 | 11.1 |
| 11/08/2019 | 10.7 |
| 11/08/2019 | 11.7 |
| 11/08/2019 | 10.2 |
| 12/08/2019 | 11.3 |
| 12/08/2019 | 12 |
| 12/08/2019 | 11.6 |
| 12/08/2019 | 15.3 |
| 12/08/2019 | 16.4 |
| 12/08/2019 | 17.3 |
| 12/08/2019 | 15.6 |
| 12/08/2019 | 13.6 |
| 12/08/2019 | 11.2 |
| 12/08/2019 | 9.5 |
| 12/08/2019 | 14.2 |
| 12/08/2019 | 18.9 |
| 12/08/2019 | 21.9 |
| 12/08/2019 | 20.5 |
| 12/08/2019 | 20.3 |
| 12/08/2019 | 20.2 |
| 12/08/2019 | 21.1 |
| 12/08/2019 | 18.1 |
| 12/08/2019 | 15.9 |
| 12/08/2019 | 13.2 |
| 12/08/2019 | 12.4 |
| 12/08/2019 | 12.2 |
| 12/08/2019 | 15 |
| 12/08/2019 | 13.7 |
| 13/08/2019 | 12.9 |
| 13/08/2019 | 9.6 |
| 13/08/2019 | 8.1 |
| 13/08/2019 | 7.8 |
| 13/08/2019 | 8.7 |
| 13/08/2019 | 8.9 |
| 13/08/2019 | 9.7 |
| 13/08/2019 | 9.1 |
| 13/08/2019 | 8.3 |
| 13/08/2019 | 8.4 |
| 13/08/2019 | 8.5 |
| 13/08/2019 | 9.1 |
| 13/08/2019 | 8.5 |
| 13/08/2019 | 9 |
| 13/08/2019 | 7.1 |
| 13/08/2019 | 5.1 |
| 13/08/2019 | 4.3 |
| 13/08/2019 | 4 |
| 13/08/2019 | 4.3 |
| 13/08/2019 | 3.8 |
| 13/08/2019 | 0.3 |
| 13/08/2019 | 1.2 |
| 13/08/2019 | 1.1 |
| 13/08/2019 | 1.9 |
| 14/08/2019 | 3.8 |
| 14/08/2019 | 3.8 |
| 14/08/2019 | 3.3 |
| 14/08/2019 | 3.5 |
| 14/08/2019 | 2.5 |
| 14/08/2019 | 3.1 |
| 14/08/2019 | 4.4 |
| 14/08/2019 | 4.9 |
| 14/08/2019 | 7.2 |
| 14/08/2019 | 7.9 |
| 14/08/2019 | 13.6 |
| 14/08/2019 | 13.3 |
| 14/08/2019 | 10.7 |
| 14/08/2019 | 11.4 |
| 14/08/2019 | 8.4 |
| 14/08/2019 | 11.5 |
| 14/08/2019 | 4.2 |
| 14/08/2019 | 7.6 |
| 14/08/2019 | 6.3 |
| 14/08/2019 | 5.7 |
| 14/08/2019 | 3.3 |
| 14/08/2019 | 1.6 |
| 14/08/2019 | 3.3 |
| 14/08/2019 | 3.1 |
| 15/08/2019 | 5.1 |
| 15/08/2019 | 4.2 |
| 15/08/2019 | 5.3 |
| 15/08/2019 | 4.5 |
| 15/08/2019 | 3.9 |
| 15/08/2019 | 3.7 |
| 15/08/2019 | 3.6 |
| 15/08/2019 | 7.7 |
| 15/08/2019 | 7.6 |
| 15/08/2019 | 4.7 |
| 15/08/2019 | 6.8 |
| 15/08/2019 | 7.9 |
| 15/08/2019 | 8.4 |
| 15/08/2019 | 7.4 |
| 15/08/2019 | 10.7 |
| 15/08/2019 | 10.9 |
| 15/08/2019 | 7.6 |
| 15/08/2019 | 9.5 |
| 15/08/2019 | 6.9 |
| 15/08/2019 | 8.4 |
| 15/08/2019 | 0.8 |
| 15/08/2019 | 2.8 |
| 15/08/2019 | 3 |
| 15/08/2019 | 4.7 |
| 16/08/2019 | 6.5 |
| 16/08/2019 | 5.9 |
| 16/08/2019 | 5.1 |
| 16/08/2019 | 4.5 |
| 16/08/2019 | 1.1 |
| 16/08/2019 | 1.8 |
| 16/08/2019 | 4.3 |
| 16/08/2019 | 3.6 |
| 16/08/2019 | 3.4 |
| 16/08/2019 | 5 |
| 16/08/2019 | 5.3 |
| 16/08/2019 | 9.2 |
| 16/08/2019 | 13.1 |
| 16/08/2019 | 15.9 |
| 16/08/2019 | 17.7 |
| 16/08/2019 | 18.6 |
| 16/08/2019 | 16.3 |
| 16/08/2019 | 12.1 |
| 16/08/2019 | 12.4 |
| 16/08/2019 | 13.1 |
| 16/08/2019 | 10.1 |
| 16/08/2019 | 6.9 |
| 16/08/2019 | 5.1 |
| 16/08/2019 | 4.9 |
| 17/08/2019 | 5.9 |
| 17/08/2019 | 6.5 |
| 17/08/2019 | 5.2 |
| 17/08/2019 | 5.4 |
| 17/08/2019 | 6.4 |
| 17/08/2019 | 7.6 |
| 17/08/2019 | 8 |
| 17/08/2019 | 9.2 |
| 17/08/2019 | 11.6 |
| 17/08/2019 | 8.9 |
| 17/08/2019 | 8.2 |
| 17/08/2019 | 11.2 |
| 17/08/2019 | 9.7 |
| 17/08/2019 | 10.7 |
| 17/08/2019 | 10.2 |
| 17/08/2019 | 13.2 |
| 17/08/2019 | 11.1 |
| 17/08/2019 | 11.2 |
| 17/08/2019 | 10.5 |
| 17/08/2019 | 5.6 |
| 17/08/2019 | 5 |
| 17/08/2019 | 4.3 |
| 17/08/2019 | 5 |
| 17/08/2019 | 5.6 |
| 18/08/2019 | 5.1 |
| 18/08/2019 | 5 |
| 18/08/2019 | 8.9 |
| 18/08/2019 | 3.9 |
| 18/08/2019 | 2 |
| 18/08/2019 | 5.8 |
| 18/08/2019 | 7.5 |
| 18/08/2019 | 10.1 |
| 18/08/2019 | 10.8 |
| 18/08/2019 | 16.9 |
| 18/08/2019 | 19.7 |
| 18/08/2019 | 19 |
| 18/08/2019 | 15.7 |
| 18/08/2019 | 15.6 |
| 18/08/2019 | 14.7 |
| 18/08/2019 | 15.6 |
| 18/08/2019 | 15.8 |
| 18/08/2019 | 10.4 |
| 18/08/2019 | 7.9 |
| 18/08/2019 | 6.1 |
| 18/08/2019 | 5.4 |
| 18/08/2019 | 6.6 |
| 18/08/2019 | 5.8 |
| 18/08/2019 | 5.2 |
| 19/08/2019 | 8.1 |
| 19/08/2019 | 3 |
| 19/08/2019 | 2.5 |
| 19/08/2019 | 2.3 |
| 19/08/2019 | 1.9 |
| 19/08/2019 | 1.2 |
| 19/08/2019 | 1.5 |
| 19/08/2019 | 0.9 |
| 19/08/2019 | 5.7 |
| 19/08/2019 | 10.6 |
| 19/08/2019 | 9.4 |
| 19/08/2019 | 11.2 |
| 19/08/2019 | 12.1 |
| 19/08/2019 | 11.1 |
| 19/08/2019 | 9.5 |
| 19/08/2019 | 9.6 |
| 19/08/2019 | 13.4 |
| 19/08/2019 | 7.6 |
| 19/08/2019 | 6.1 |
| 19/08/2019 | 7.4 |
| 19/08/2019 | 8.8 |
| 19/08/2019 | 12.5 |
| 19/08/2019 | 13 |
| 19/08/2019 | 12.3 |
| 20/08/2019 | 6.6 |
| 20/08/2019 | 10.8 |
| 20/08/2019 | 9.9 |
| 20/08/2019 | 4.9 |
| 20/08/2019 | 5.3 |
| 20/08/2019 | 3.5 |
| 20/08/2019 | 6 |
| 20/08/2019 | 5.8 |
| 20/08/2019 | 6.2 |
| 20/08/2019 | 7.2 |
| 20/08/2019 | 8.5 |
| 20/08/2019 | 8.4 |
| 20/08/2019 | 7.5 |
| 20/08/2019 | 4.3 |
| 20/08/2019 | 5 |
| 20/08/2019 | 5.1 |
| 20/08/2019 | 6.1 |
| 20/08/2019 | 6.3 |
| 20/08/2019 | 5.6 |
| 20/08/2019 | 3.1 |
| 20/08/2019 | 1.9 |
| 20/08/2019 | 2.4 |
| 20/08/2019 | 3.3 |
| 20/08/2019 | 1.4 |
| 21/08/2019 | 1.9 |
| 21/08/2019 | 3.1 |
| 21/08/2019 | 2.1 |
| 21/08/2019 | 1.2 |
| 21/08/2019 | 1.4 |
| 21/08/2019 | 1.3 |
| 21/08/2019 | 0.7 |
| 21/08/2019 | 3.5 |
| 21/08/2019 | 5.3 |
| 21/08/2019 | 6 |
| 21/08/2019 | 4.2 |
| 21/08/2019 | 2.3 |
| 21/08/2019 | 2.3 |
| 21/08/2019 | 2.5 |
| 21/08/2019 | 3.4 |
| 21/08/2019 | 1.3 |
| 21/08/2019 | 6.2 |
| 21/08/2019 | 8.1 |
| 21/08/2019 | 8.1 |
| 21/08/2019 | 7 |
| 21/08/2019 | 9.2 |
| 21/08/2019 | 11.1 |
| 21/08/2019 | 12.9 |
| 21/08/2019 | 15.6 |
| 22/08/2019 | 13 |
| 22/08/2019 | 11.8 |
| 22/08/2019 | 15.8 |
| 22/08/2019 | 19.5 |
| 22/08/2019 | 17.3 |
| 22/08/2019 | 16.7 |
| 22/08/2019 | 17.3 |
| 22/08/2019 | 14.6 |
| 22/08/2019 | 14.5 |
| 22/08/2019 | 17.6 |
| 22/08/2019 | 17.8 |
| 22/08/2019 | 20.4 |
| 22/08/2019 | 21.2 |
| 22/08/2019 | 21.8 |
| 22/08/2019 | 22.3 |
| 22/08/2019 | 20.6 |
| 22/08/2019 | 20.6 |
| 22/08/2019 | 17.3 |
| 22/08/2019 | 16.6 |
| 22/08/2019 | 13.4 |
| 22/08/2019 | 11.6 |
| 22/08/2019 | 13.1 |
| 22/08/2019 | 11.8 |
| 22/08/2019 | 13.7 |
| 23/08/2019 | 14.8 |
| 23/08/2019 | 10.8 |
| 23/08/2019 | 8.8 |
| 23/08/2019 | 10.3 |
| 23/08/2019 | 12.4 |
| 23/08/2019 | 12.4 |
| 23/08/2019 | 13 |
| 23/08/2019 | 12.5 |
| 23/08/2019 | 13.6 |
| 23/08/2019 | 11.6 |
| 23/08/2019 | 12.4 |
| 23/08/2019 | 12 |
| 23/08/2019 | 12.2 |
| 23/08/2019 | 12.2 |
| 23/08/2019 | 12 |
| 23/08/2019 | 6.7 |
| 23/08/2019 | 8.1 |
| 23/08/2019 | 13.9 |
| 23/08/2019 | 13.6 |
| 23/08/2019 | 11.1 |
| 23/08/2019 | 11.3 |
| 23/08/2019 | 9.7 |
| 23/08/2019 | 7.3 |
| 23/08/2019 | 6.9 |
| 24/08/2019 | 3 |
| 24/08/2019 | 3.1 |
| 24/08/2019 | 7.4 |
| 24/08/2019 | 7.2 |
| 24/08/2019 | 8.2 |
| 24/08/2019 | 8.6 |
| 24/08/2019 | 4 |
| 24/08/2019 | 0.8 |
| 24/08/2019 | 5.1 |
| 24/08/2019 | 4.5 |
| 24/08/2019 | 5 |
| 24/08/2019 | 4.4 |
| 24/08/2019 | 5.3 |
| 24/08/2019 | 6 |
| 24/08/2019 | 8.4 |
| 24/08/2019 | 8.9 |
| 24/08/2019 | 6.5 |
| 24/08/2019 | 5.9 |
| 24/08/2019 | 4 |
| 24/08/2019 | 3.7 |
| 24/08/2019 | 3.4 |
| 24/08/2019 | 8.1 |
| 24/08/2019 | 8 |
| 24/08/2019 | 7.7 |
| 25/08/2019 | 7.9 |
| 25/08/2019 | 9.5 |
| 25/08/2019 | 10.1 |
| 25/08/2019 | 9.8 |
| 25/08/2019 | 10.1 |
| 25/08/2019 | 0.6 |
| 25/08/2019 | 0.9 |
| 25/08/2019 | 2.4 |
| 25/08/2019 | 4.2 |
| 25/08/2019 | 1.9 |
| 25/08/2019 | 1.8 |
| 25/08/2019 | 4.5 |
| 25/08/2019 | 5.6 |
| 25/08/2019 | 8.5 |
| 25/08/2019 | 8.1 |
| 25/08/2019 | 11.1 |
| 25/08/2019 | 11.1 |
| 25/08/2019 | 9.4 |
| 25/08/2019 | 10.1 |
| 25/08/2019 | 9.1 |
| 25/08/2019 | 9.1 |
| 25/08/2019 | 6 |
| 25/08/2019 | 5.9 |
| 25/08/2019 | 7.2 |
| 26/08/2019 | 7.1 |
| 26/08/2019 | 5.9 |
| 26/08/2019 | 6.7 |
| 26/08/2019 | 6 |
| 26/08/2019 | 6.2 |
| 26/08/2019 | 6.2 |
| 26/08/2019 | 5.7 |
| 26/08/2019 | 7.4 |
| 26/08/2019 | 9.5 |
| 26/08/2019 | 8.3 |
| 26/08/2019 | 10 |
| 26/08/2019 | 12.7 |
| 26/08/2019 | 12.8 |
| 26/08/2019 | 14.8 |
| 26/08/2019 | 12.6 |
| 26/08/2019 | 12.9 |
| 26/08/2019 | 12 |
| 26/08/2019 | 12.2 |
| 26/08/2019 | 13.8 |
| 26/08/2019 | 10.5 |
| 26/08/2019 | 8.1 |
| 26/08/2019 | 4.6 |
| 26/08/2019 | 5.5 |
| 26/08/2019 | 6.9 |
| 27/08/2019 | 7.4 |
| 27/08/2019 | 9 |
| 27/08/2019 | 9.6 |
| 27/08/2019 | 11.9 |
| 27/08/2019 | 14 |
| 27/08/2019 | 11.4 |
| 27/08/2019 | 13.9 |
| 27/08/2019 | 13.6 |
| 27/08/2019 | 12.7 |
| 27/08/2019 | 15.1 |
| 27/08/2019 | 15 |
| 27/08/2019 | 14.8 |
| 27/08/2019 | 16.6 |
| 27/08/2019 | 15.4 |
| 27/08/2019 | 16 |
| 27/08/2019 | 14.6 |
| 27/08/2019 | 13.2 |
| 27/08/2019 | 12.6 |
| 27/08/2019 | 11 |
| 27/08/2019 | 10.2 |
| 27/08/2019 | 5.1 |
| 27/08/2019 | 5 |
| 27/08/2019 | 4.4 |
| 27/08/2019 | 4.6 |
| 28/08/2019 | 4.7 |
| 28/08/2019 | 4.4 |
| 28/08/2019 | 4 |
| 28/08/2019 | 4.4 |
| 28/08/2019 | 4.9 |
| 28/08/2019 | 5.1 |
| 28/08/2019 | 6 |
| 28/08/2019 | 6.8 |
| 28/08/2019 | 7.1 |
| 28/08/2019 | 8.3 |
| 28/08/2019 | 11 |
| 28/08/2019 | 13.2 |
| 28/08/2019 | 13.6 |
| 28/08/2019 | 14.6 |
| 28/08/2019 | 13.9 |
| 28/08/2019 | 16.4 |
| 28/08/2019 | 16.1 |
| 28/08/2019 | 12.6 |
| 28/08/2019 | 16 |
| 28/08/2019 | 7 |
| 28/08/2019 | 5.2 |
| 28/08/2019 | 5.4 |
| 28/08/2019 | 7 |
| 28/08/2019 | 12.6 |
| 29/08/2019 | 7.2 |
| 29/08/2019 | 7 |
| 29/08/2019 | 8.3 |
| 29/08/2019 | 7.6 |
| 29/08/2019 | 7.7 |
| 29/08/2019 | 9.1 |
| 29/08/2019 | 8.7 |
| 29/08/2019 | 8.8 |
| 29/08/2019 | 8.9 |
| 29/08/2019 | 10.1 |
| 29/08/2019 | 11.8 |
| 29/08/2019 | 12.1 |
| 29/08/2019 | 10.9 |
| 29/08/2019 | 9.2 |
| 29/08/2019 | 8.7 |
| 29/08/2019 | 10 |
| 29/08/2019 | 10 |
| 29/08/2019 | 9.5 |
| 29/08/2019 | 6.9 |
| 29/08/2019 | 5.5 |
| 29/08/2019 | 5.9 |
| 29/08/2019 | 5.2 |
| 29/08/2019 | 2.5 |
| 29/08/2019 | 1.4 |
| 30/08/2019 | 1.4 |
| 30/08/2019 | 2.6 |
| 30/08/2019 | 3.5 |
| 30/08/2019 | 3.5 |
| 30/08/2019 | 1.1 |
| 30/08/2019 | 1.3 |
| 30/08/2019 | 0.7 |
| 30/08/2019 | 1.4 |
| 30/08/2019 | 1.9 |
| 30/08/2019 | 4.2 |
| 30/08/2019 | 5.7 |
| 30/08/2019 | 6 |
| 30/08/2019 | 6.7 |
| 30/08/2019 | 7.1 |
| 30/08/2019 | 3.6 |
| 30/08/2019 | 6.1 |
| 30/08/2019 | 7.2 |
| 30/08/2019 | 7 |
| 30/08/2019 | 9 |
| 30/08/2019 | 8.4 |
| 30/08/2019 | 10.2 |
| 30/08/2019 | 9.1 |
| 30/08/2019 | 9 |
| 30/08/2019 | 7.9 |
| 31/08/2019 | 8 |
| 31/08/2019 | 5.5 |
| 31/08/2019 | 4.8 |
| 31/08/2019 | 5.8 |
| 31/08/2019 | 6 |
| 31/08/2019 | 5 |
| 31/08/2019 | 5.6 |
| 31/08/2019 | 6.1 |
| 31/08/2019 | 6.6 |
| 31/08/2019 | 5.3 |
| 31/08/2019 | 4.9 |
| 31/08/2019 | 8.2 |
| 31/08/2019 | 9.4 |
| 31/08/2019 | 9.1 |
| 31/08/2019 | 10.3 |
| 31/08/2019 | 10.5 |
| 31/08/2019 | 9.7 |
| 31/08/2019 | 7.1 |
| 31/08/2019 | 5.6 |
| 31/08/2019 | 4.1 |
| 31/08/2019 | 5.3 |
| 31/08/2019 | 5.3 |
| 31/08/2019 | 3.5 |
| 31/08/2019 | 3.5 |